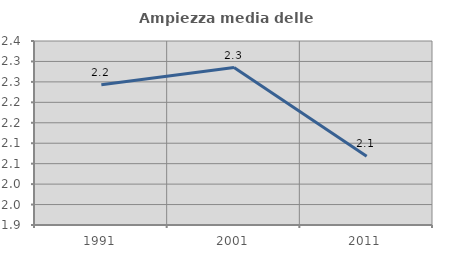
| Category | Ampiezza media delle famiglie |
|---|---|
| 1991.0 | 2.243 |
| 2001.0 | 2.285 |
| 2011.0 | 2.068 |